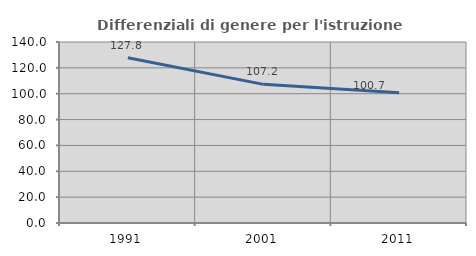
| Category | Differenziali di genere per l'istruzione superiore |
|---|---|
| 1991.0 | 127.835 |
| 2001.0 | 107.228 |
| 2011.0 | 100.717 |